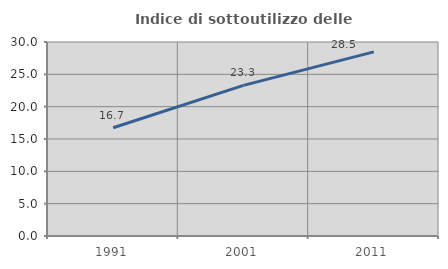
| Category | Indice di sottoutilizzo delle abitazioni  |
|---|---|
| 1991.0 | 16.733 |
| 2001.0 | 23.288 |
| 2011.0 | 28.477 |